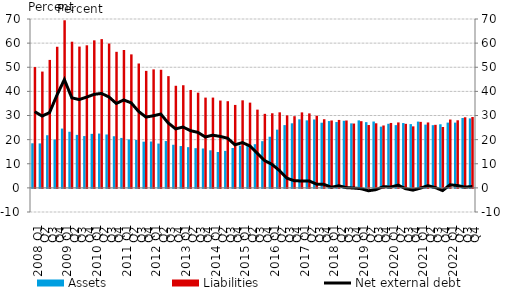
| Category | Assets | Liabilities |
|---|---|---|
|   2008 Q1 | 18.483 | 50.075 |
| Q2 | 18.442 | 48.208 |
| Q3 | 21.823 | 53.038 |
| Q4 | 20.026 | 58.492 |
|   2009 Q1 | 24.58 | 69.47 |
| Q2 | 23.259 | 60.585 |
| Q3 | 21.967 | 58.566 |
| Q4 | 21.482 | 59.097 |
|  2010 Q1 | 22.395 | 61.153 |
| Q2 | 22.513 | 61.662 |
| Q3 | 22.134 | 59.837 |
| Q4 | 21.402 | 56.399 |
|  2011 Q1 | 20.704 | 57.14 |
| Q2 | 20.081 | 55.338 |
| Q3 | 19.855 | 51.558 |
| Q4 | 19.152 | 48.501 |
|  2012 Q1 | 19.22 | 49.112 |
| Q2 | 18.364 | 48.957 |
| Q3 | 19.411 | 46.318 |
| Q4 | 17.87 | 42.325 |
|  2013 Q1 | 17.33 | 42.546 |
| Q2 | 16.878 | 40.585 |
| Q3 | 16.459 | 39.461 |
| Q4 | 16.326 | 37.42 |
|  2014 Q1 | 15.574 | 37.426 |
| Q2 | 14.875 | 36.199 |
| Q3 | 15.337 | 35.925 |
| Q4 | 16.531 | 34.383 |
|  2015 Q1 | 17.525 | 36.29 |
| Q2 | 17.923 | 35.336 |
| Q3 | 18.103 | 32.434 |
| Q4 | 19.362 | 30.694 |
|  2016 Q1 | 21.202 | 30.927 |
| Q2 | 24.137 | 31.313 |
| Q3 | 26.019 | 30.04 |
| Q4 | 26.769 | 29.716 |
|  2017 Q1 | 28.428 | 31.295 |
| Q2 | 27.994 | 30.876 |
| Q3 | 28.351 | 29.906 |
| Q4 | 27.006 | 28.455 |
|  2018 Q1 | 27.695 | 27.946 |
| Q2 | 27.291 | 28.158 |
| Q3 | 27.826 | 27.931 |
| Q4 | 26.738 | 26.668 |
|  2019 Q1 | 27.981 | 27.642 |
| Q2 | 27.244 | 26.05 |
| Q3 | 27.502 | 26.768 |
| Q4 | 25.378 | 25.866 |
|  2020 Q1 | 26.566 | 26.913 |
| Q2 | 26.012 | 27.132 |
| Q3 | 26.876 | 26.546 |
| Q4 | 26.433 | 25.496 |
| 2021 Q1 | 27.478 | 27.358 |
| Q2 | 26.208 | 27.121 |
| Q3 | 25.986 | 26.135 |
| Q4 | 26.365 | 25.239 |
| 2022 Q1 | 27.054 | 28.327 |
| Q2 | 27.051 | 28.02 |
| Q3 | 28.957 | 29.265 |
| Q4 | 28.802 | 29.373 |